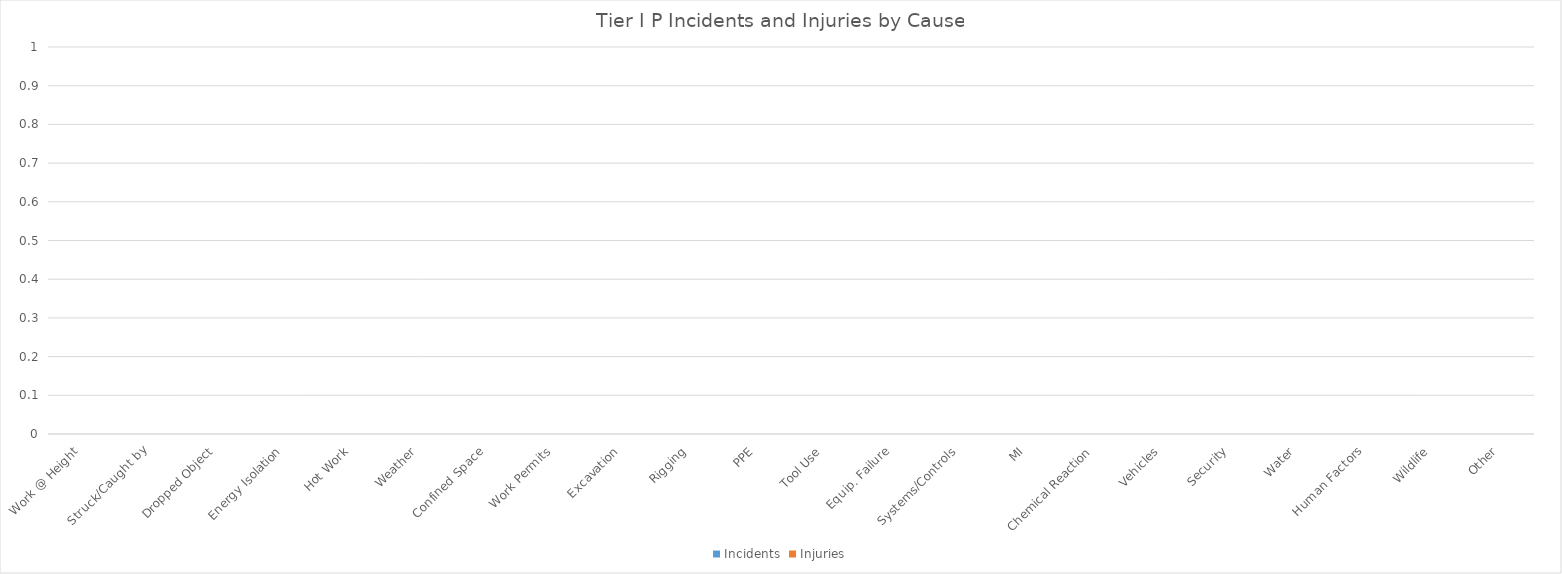
| Category | Incidents | Injuries |
|---|---|---|
| Work @ Height | 0 | 0 |
| Struck/Caught by | 0 | 0 |
| Dropped Object | 0 | 0 |
| Energy Isolation | 0 | 0 |
| Hot Work | 0 | 0 |
| Weather | 0 | 0 |
| Confined Space | 0 | 0 |
| Work Permits | 0 | 0 |
| Excavation | 0 | 0 |
| Rigging | 0 | 0 |
| PPE | 0 | 0 |
| Tool Use | 0 | 0 |
| Equip. Failure | 0 | 0 |
| Systems/Controls | 0 | 0 |
| MI | 0 | 0 |
| Chemical Reaction | 0 | 0 |
| Vehicles | 0 | 0 |
| Security | 0 | 0 |
| Water | 0 | 0 |
| Human Factors | 0 | 0 |
| Wildlife | 0 | 0 |
| Other | 0 | 0 |